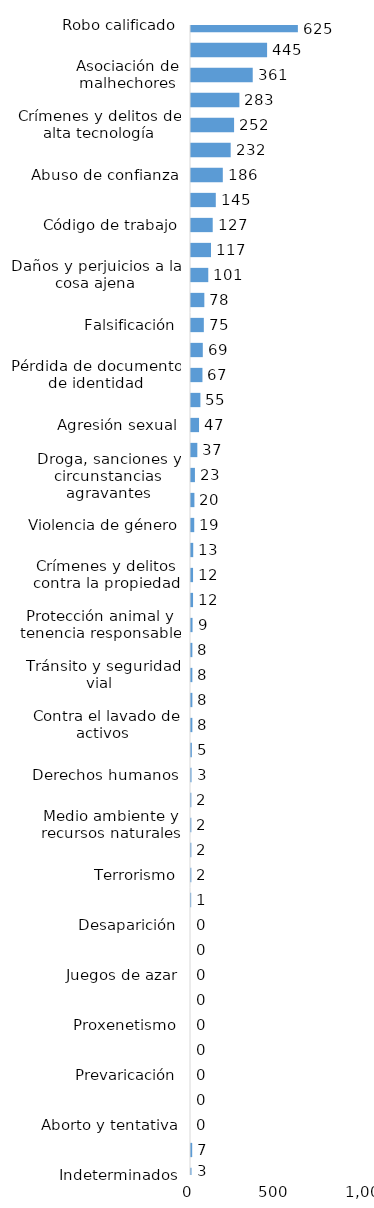
| Category | Series 0 |
|---|---|
| Robo calificado | 625 |
| Golpes y heridas | 445 |
| Asociación de malhechores | 361 |
| Droga, traficante de droga | 283 |
| Crímenes y delitos de alta tecnología | 252 |
| Amenaza | 232 |
| Abuso de confianza | 186 |
| Estafa | 145 |
| Código de trabajo | 127 |
| Violencia intrafamiliar | 117 |
| Daños y perjuicios a la cosa ajena | 101 |
| Ley de armas | 78 |
| Falsificación | 75 |
| Código del menor NNA | 69 |
| Pérdida de documento de identidad | 67 |
| Homicidio | 55 |
| Agresión sexual | 47 |
| Tráfico ilícito de migrantes y trata de personas | 37 |
| Droga, sanciones y circunstancias agravantes | 23 |
| Droga, distribución de droga | 20 |
| Violencia de género | 19 |
| Propiedad industrial, intelectual y derecho de autor | 13 |
| Crímenes y delitos contra la propiedad | 12 |
| Robo simple | 12 |
| Protección animal y tenencia responsable | 9 |
| Tentativa de homicidio | 8 |
| Tránsito y seguridad vial  | 8 |
| Difamación e injuria | 8 |
| Contra el lavado de activos  | 8 |
| Violación sexual | 5 |
| Derechos humanos | 3 |
| Droga, simple posesión | 2 |
| Medio ambiente y recursos naturales | 2 |
| Ley general de salud | 2 |
| Terrorismo | 2 |
| Secuestro | 1 |
| Desaparición | 0 |
| Conflictos sociales | 0 |
| Juegos de azar | 0 |
| Ley de cheques | 0 |
| Proxenetismo | 0 |
| Soborno | 0 |
| Prevaricación | 0 |
| Droga, delitos y sanciones | 0 |
| Aborto y tentativa | 0 |
| Otros | 7 |
| Indeterminados | 3 |